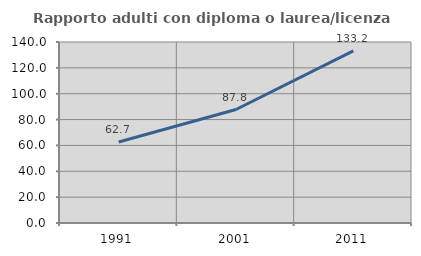
| Category | Rapporto adulti con diploma o laurea/licenza media  |
|---|---|
| 1991.0 | 62.677 |
| 2001.0 | 87.765 |
| 2011.0 | 133.163 |